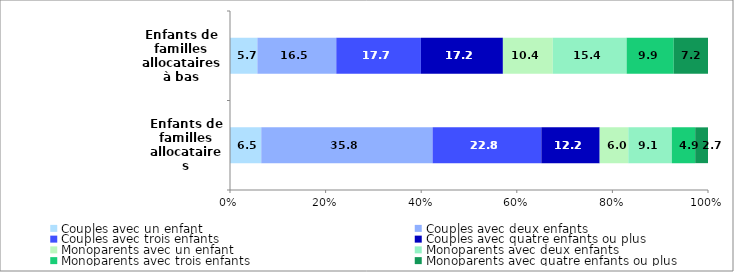
| Category | Couples avec un enfant | Couples avec deux enfants | Couples avec trois enfants | Couples avec quatre enfants ou plus | Monoparents avec un enfant | Monoparents avec deux enfants | Monoparents avec trois enfants | Monoparents avec quatre enfants ou plus |
|---|---|---|---|---|---|---|---|---|
| Enfants de familles allocataires | 6.542 | 35.838 | 22.756 | 12.205 | 5.981 | 9.105 | 4.892 | 2.682 |
| Enfants de familles allocataires à bas revenus | 5.727 | 16.508 | 17.7 | 17.155 | 10.445 | 15.442 | 9.863 | 7.16 |